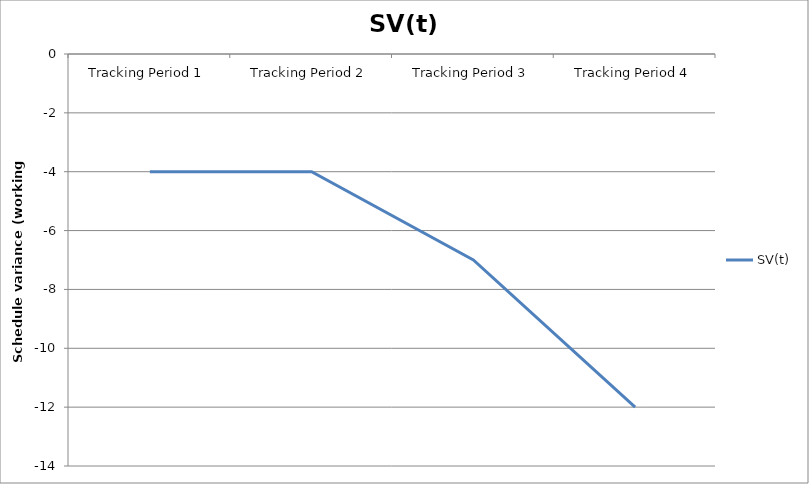
| Category | SV(t) |
|---|---|
| Tracking Period 1 | -4 |
| Tracking Period 2 | -4 |
| Tracking Period 3 | -7 |
| Tracking Period 4 | -12 |